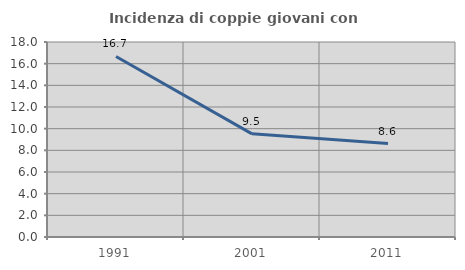
| Category | Incidenza di coppie giovani con figli |
|---|---|
| 1991.0 | 16.667 |
| 2001.0 | 9.524 |
| 2011.0 | 8.627 |